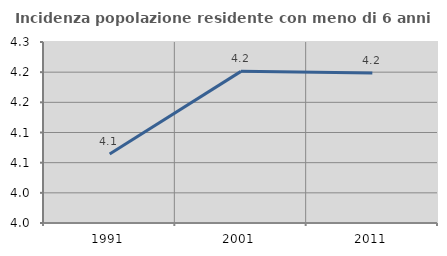
| Category | Incidenza popolazione residente con meno di 6 anni |
|---|---|
| 1991.0 | 4.064 |
| 2001.0 | 4.201 |
| 2011.0 | 4.199 |